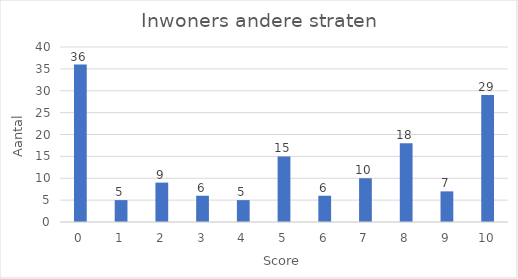
| Category | Aantal |
|---|---|
| 0.0 | 36 |
| 1.0 | 5 |
| 2.0 | 9 |
| 3.0 | 6 |
| 4.0 | 5 |
| 5.0 | 15 |
| 6.0 | 6 |
| 7.0 | 10 |
| 8.0 | 18 |
| 9.0 | 7 |
| 10.0 | 29 |